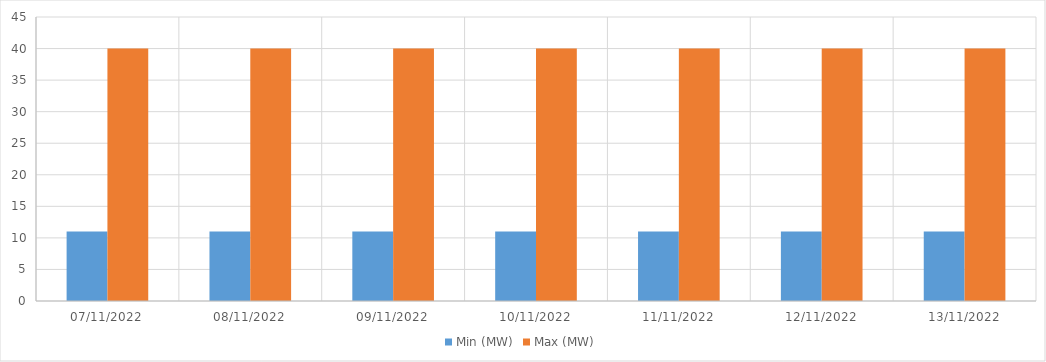
| Category | Min (MW) | Max (MW) |
|---|---|---|
| 07/11/2022 | 11 | 40 |
| 08/11/2022 | 11 | 40 |
| 09/11/2022 | 11 | 40 |
| 10/11/2022 | 11 | 40 |
| 11/11/2022 | 11 | 40 |
| 12/11/2022 | 11 | 40 |
| 13/11/2022 | 11 | 40 |